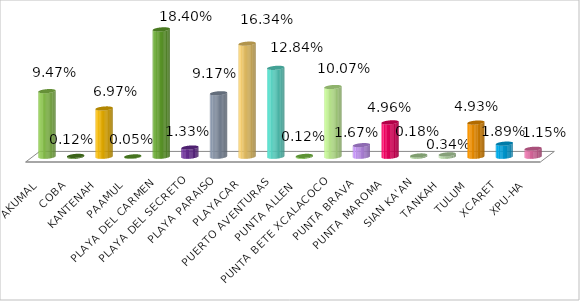
| Category | AKUMAL COBA KANTENAH PAAMUL PLAYA DEL CARMEN PLAYA DEL SECRETO PLAYA PARAISO PLAYACAR PUERTO AVENTURAS PUNTA ALLEN  PUNTA BETE XCALACOCO PUNTA BRAVA PUNTA MAROMA SIAN KA'AN TANKAH TULUM XCARET XPU-HA |
|---|---|
| AKUMAL | 0.095 |
| COBA | 0.001 |
| KANTENAH | 0.07 |
| PAAMUL | 0 |
| PLAYA DEL CARMEN | 0.184 |
| PLAYA DEL SECRETO | 0.013 |
| PLAYA PARAISO | 0.092 |
| PLAYACAR | 0.163 |
| PUERTO AVENTURAS | 0.128 |
| PUNTA ALLEN  | 0.001 |
| PUNTA BETE XCALACOCO | 0.101 |
| PUNTA BRAVA | 0.017 |
| PUNTA MAROMA | 0.05 |
| SIAN KA'AN | 0.002 |
| TANKAH | 0.003 |
| TULUM | 0.049 |
| XCARET | 0.019 |
| XPU-HA | 0.012 |